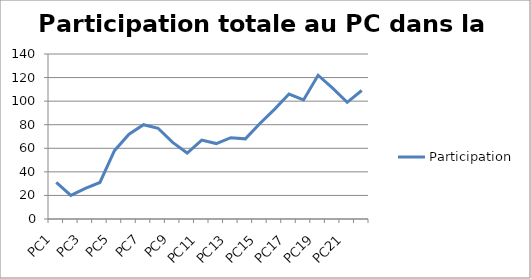
| Category | Participation |
|---|---|
| PC1 | 31 |
| PC2 | 20 |
| PC3 | 26 |
| PC4 | 31 |
| PC5 | 58 |
| PC6 | 72 |
| PC7 | 80 |
| PC8 | 77 |
| PC9 | 65 |
| PC10 | 56 |
| PC11 | 67 |
| PC12 | 64 |
| PC13 | 69 |
| PC14 | 68 |
| PC15 | 81 |
| PC16 | 93 |
| PC17 | 106 |
| PC18 | 101 |
| PC19 | 122 |
| PC20 | 111 |
| PC21 | 99 |
| PC22 | 109 |